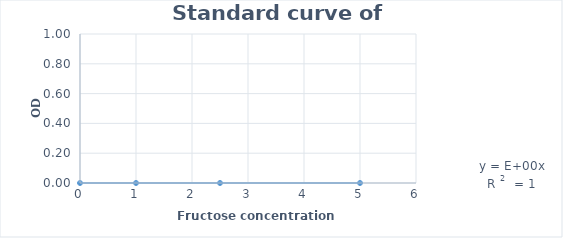
| Category | Series 0 |
|---|---|
| 0.0 | 0 |
| 1.0 | 0 |
| 2.5 | 0 |
| 5.0 | 0 |